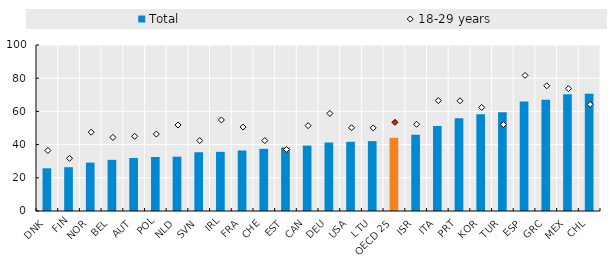
| Category | Total |
|---|---|
| DNK | 25.722 |
| FIN | 26.38 |
| NOR | 29.152 |
| BEL | 30.827 |
| AUT | 31.916 |
| POL | 32.548 |
| NLD | 32.712 |
| SVN | 35.397 |
| IRL | 35.635 |
| FRA | 36.463 |
| CHE | 37.441 |
| EST | 38.268 |
| CAN | 39.404 |
| DEU | 41.257 |
| USA | 41.695 |
| LTU | 42.115 |
| OECD 25 | 44.059 |
| ISR | 45.955 |
| ITA | 51.198 |
| PRT | 55.842 |
| KOR | 58.299 |
| TUR | 59.443 |
| ESP | 65.903 |
| GRC | 66.969 |
| MEX | 70.333 |
| CHL | 70.606 |